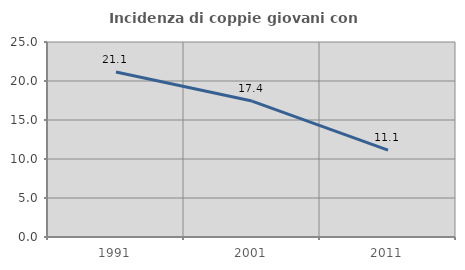
| Category | Incidenza di coppie giovani con figli |
|---|---|
| 1991.0 | 21.149 |
| 2001.0 | 17.427 |
| 2011.0 | 11.148 |